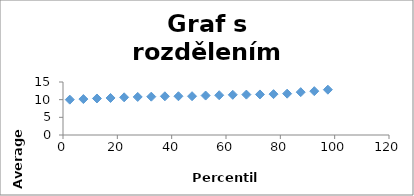
| Category | Series 0 |
|---|---|
| 2.5 | 10.006 |
| 7.5 | 10.171 |
| 12.5 | 10.335 |
| 17.5 | 10.479 |
| 22.5 | 10.665 |
| 27.5 | 10.771 |
| 32.5 | 10.847 |
| 37.5 | 10.953 |
| 42.5 | 10.971 |
| 47.5 | 10.976 |
| 52.5 | 11.165 |
| 57.5 | 11.253 |
| 62.5 | 11.376 |
| 67.5 | 11.429 |
| 72.5 | 11.476 |
| 77.5 | 11.565 |
| 82.5 | 11.7 |
| 87.5 | 12.124 |
| 92.5 | 12.407 |
| 97.5 | 12.825 |